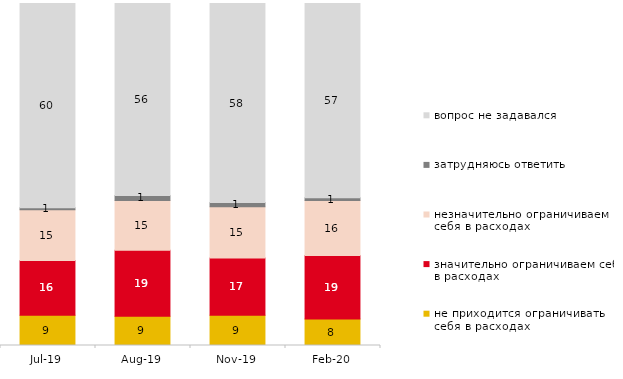
| Category | не приходится ограничивать себя в расходах | значительно ограничиваем себя в расходах | незначительно ограничиваем себя в расходах | затрудняюсь ответить | вопрос не задавался |
|---|---|---|---|---|---|
| 2019-07-01 | 8.861 | 15.99 | 14.851 | 0.545 | 59.752 |
| 2019-08-01 | 8.541 | 19.331 | 14.535 | 1.449 | 56.144 |
| 2019-11-01 | 8.861 | 16.733 | 14.95 | 1.238 | 58.218 |
| 2020-02-01 | 7.723 | 18.614 | 16.04 | 0.842 | 56.782 |